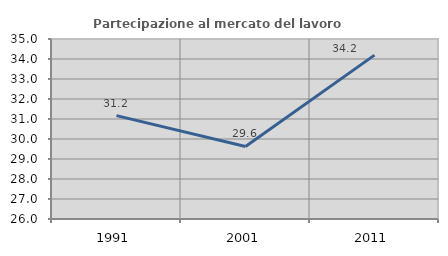
| Category | Partecipazione al mercato del lavoro  femminile |
|---|---|
| 1991.0 | 31.168 |
| 2001.0 | 29.626 |
| 2011.0 | 34.194 |